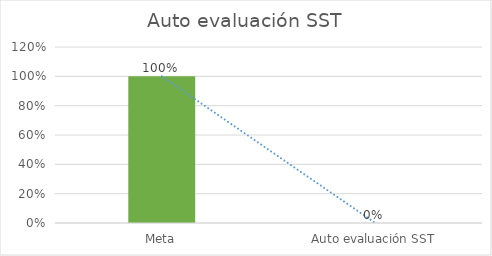
| Category | Series 0 |
|---|---|
| Meta | 1 |
| Auto evaluación SST | 0 |